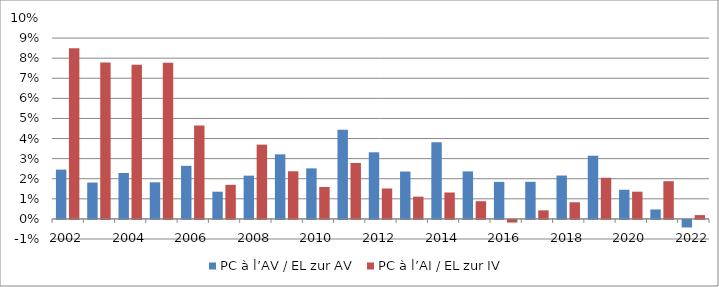
| Category | PC à l’AV / EL zur AV | PC à l’AI / EL zur IV |
|---|---|---|
| 2002 | 0.025 | 0.085 |
| 2003* | 0.018 | 0.078 |
| 2004 | 0.023 | 0.077 |
| 2005* | 0.018 | 0.078 |
| 2006 | 0.026 | 0.047 |
| 2007* | 0.014 | 0.017 |
| 2008 | 0.022 | 0.037 |
| 2009* | 0.032 | 0.024 |
| 2010 | 0.025 | 0.016 |
| 2011* | 0.044 | 0.028 |
| 2012 | 0.033 | 0.015 |
| 2013* | 0.024 | 0.011 |
| 2014 | 0.038 | 0.013 |
| 2015* | 0.024 | 0.009 |
| 2016 | 0.018 | -0.001 |
| 2017 | 0.018 | 0.004 |
| 2018 | 0.022 | 0.008 |
| 2019* | 0.031 | 0.02 |
| 2020 | 0.015 | 0.014 |
| 2021 | 0.005 | 0.019 |
| 2022 | -0.004 | 0.002 |